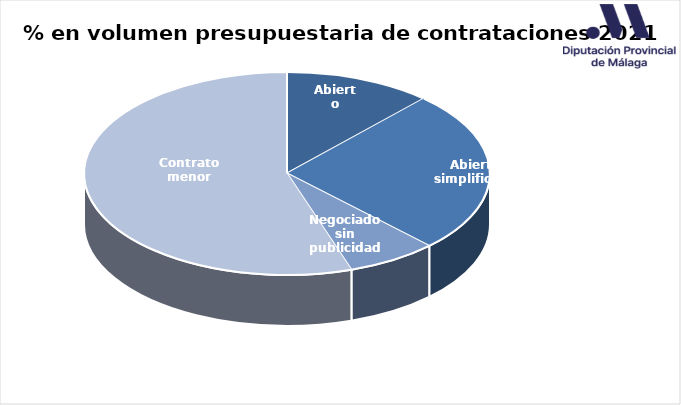
| Category | Series 0 |
|---|---|
| Abierto | 0.118 |
| Abierto simplificado | 0.259 |
| Negociado sin publicidad | 0.072 |
| Contrato menor | 0.551 |